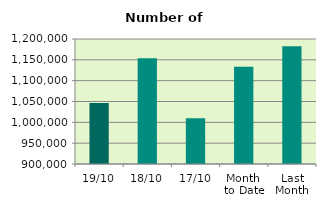
| Category | Series 0 |
|---|---|
| 19/10 | 1046414 |
| 18/10 | 1153834 |
| 17/10 | 1009894 |
| Month 
to Date | 1133386.923 |
| Last
Month | 1182612.273 |